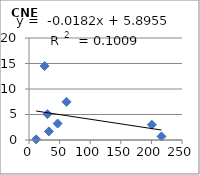
| Category | CNE |
|---|---|
| 25.5 | 14.5 |
| 61.3 | 7.49 |
| 11.7 | 0.12 |
| 216.5 | 0.69 |
| 46.8 | 3.22 |
| 32.5 | 1.69 |
| 200.8 | 2.99 |
| 30.1 | 5.07 |